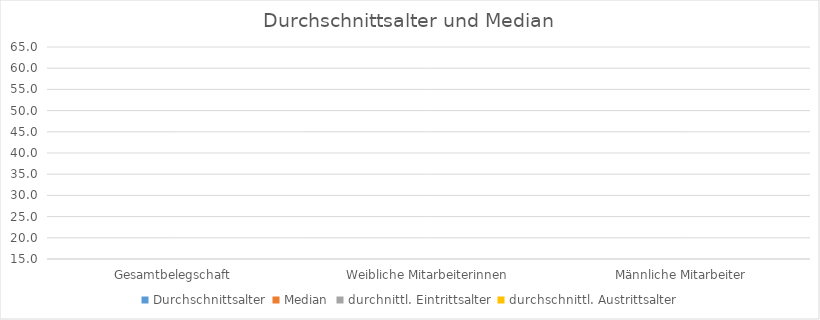
| Category | Durchschnittsalter | Median | durchnittl. Eintrittsalter | durchschnittl. Austrittsalter |
|---|---|---|---|---|
| Gesamtbelegschaft | 0 | 0 | 0 | 0 |
| Weibliche Mitarbeiterinnen | 0 | 0 | 0 | 0 |
| Männliche Mitarbeiter | 0 | 0 | 0 | 0 |